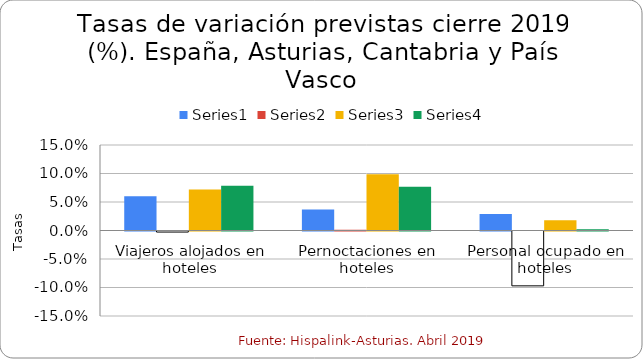
| Category | Series 0 | Series 1 | Series 2 | Series 3 |
|---|---|---|---|---|
| Viajeros alojados en hoteles | 0.06 | -0.002 | 0.072 | 0.079 |
| Pernoctaciones en hoteles | 0.037 | 0.001 | 0.099 | 0.077 |
| Personal ocupado en hoteles | 0.029 | -0.096 | 0.018 | 0.002 |